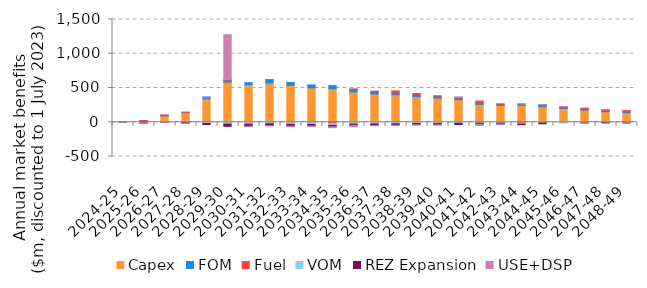
| Category | Capex | FOM | Fuel | VOM | REZ Expansion | USE+DSP |
|---|---|---|---|---|---|---|
| 2024-25 | 0 | 0 | 1.966 | -1.445 | 0.052 | 0 |
| 2025-26 | 15.722 | 1.666 | -18.743 | -0.05 | 1.078 | -0.363 |
| 2026-27 | 91.1 | 8.689 | 7.005 | -0.729 | -2.576 | -0.229 |
| 2027-28 | 138.042 | 7.49 | 0.391 | -0.79 | -11.317 | -1.663 |
| 2028-29 | 340.931 | 26.729 | -1.878 | -17.266 | -13.849 | 1.643 |
| 2029-30 | 585.641 | 30.291 | 6.018 | -27.152 | -32.608 | 656.485 |
| 2030-31 | 549.196 | 28.528 | -0.556 | -27.235 | -30.434 | 0 |
| 2031-32 | 576.147 | 47.455 | -1.364 | -20.426 | -28.527 | 0 |
| 2032-33 | 536.083 | 44.116 | -3.847 | -25.703 | -26.586 | -0.01 |
| 2033-34 | 503.041 | 41.627 | -4.025 | -26.988 | -24.15 | -0.074 |
| 2034-35 | 490.474 | 44.652 | -19.52 | -26.767 | -19.895 | -12.626 |
| 2035-36 | 442.395 | 36.192 | 8.54 | -26.662 | -18.704 | -19.644 |
| 2036-37 | 412.285 | 33.728 | 7.912 | -24.681 | -23.677 | 0 |
| 2037-38 | 401.001 | 33.482 | 23.674 | -22.793 | -19.544 | -0.431 |
| 2038-39 | 374.767 | 31.291 | 13.201 | -18.248 | -18.587 | -0.061 |
| 2039-40 | 351.177 | 29.322 | 5.618 | -18.626 | -18.271 | -4.311 |
| 2040-41 | 330.389 | 27.958 | 7.79 | -15.829 | -16.825 | 0.111 |
| 2041-42 | 260.291 | 21.428 | 28.181 | -12.882 | -15.023 | -19.677 |
| 2042-43 | 246.051 | 18.835 | 2.169 | -13.747 | -13.229 | -5.024 |
| 2043-44 | 246.752 | 19.763 | -13.691 | -13.345 | -8.827 | 1.115 |
| 2044-45 | 227.568 | 18.076 | 10.557 | -12.075 | -10.012 | 0.148 |
| 2045-46 | 199.313 | 11.749 | 9.397 | -11.037 | 0.749 | 3.74 |
| 2046-47 | 176.783 | 13.655 | 16.378 | -11.449 | -0.505 | -6.113 |
| 2047-48 | 154.258 | 17.535 | 11.728 | -8.816 | -0.476 | 1.783 |
| 2048-49 | 140.133 | 15.97 | 14.662 | -7.973 | -1.345 | -0.268 |